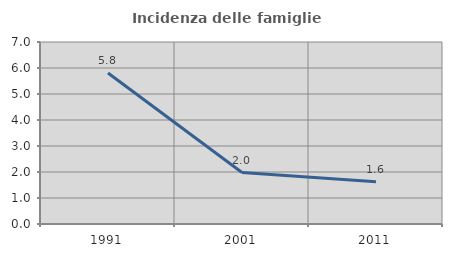
| Category | Incidenza delle famiglie numerose |
|---|---|
| 1991.0 | 5.806 |
| 2001.0 | 1.98 |
| 2011.0 | 1.629 |